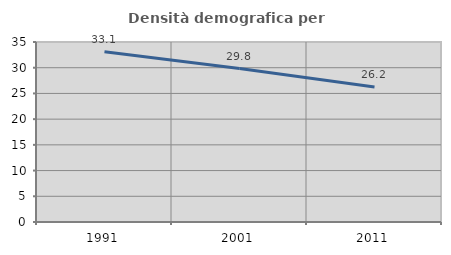
| Category | Densità demografica |
|---|---|
| 1991.0 | 33.113 |
| 2001.0 | 29.841 |
| 2011.0 | 26.233 |